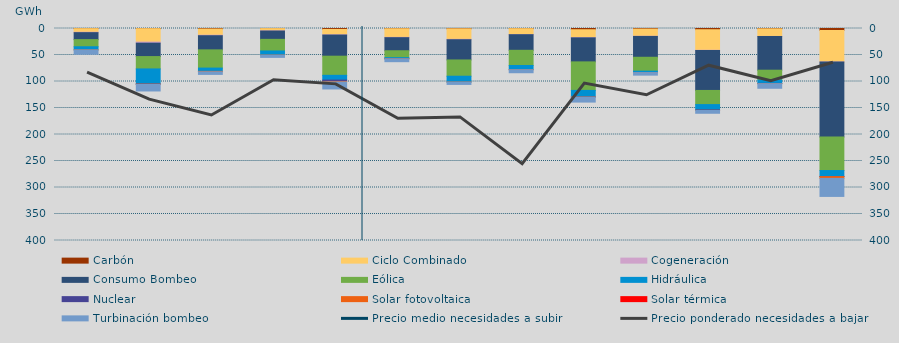
| Category | Carbón | Ciclo Combinado | Cogeneración | Consumo Bombeo | Eólica | Hidráulica | Nuclear | Solar fotovoltaica | Solar térmica | Turbinación bombeo |
|---|---|---|---|---|---|---|---|---|---|---|
| 0 | 269 | 6775.2 | 801.3 | 13110.1 | 13483.2 | 5930 | 0 | 58 | 0 | 8083.8 |
| 1 | 301 | 25336.5 | 2018 | 25298.1 | 23328.3 | 28317.4 | 441 | 400.1 | 0 | 12441 |
| 2 | 986.1 | 11670.3 | 960.4 | 26699.8 | 34355.5 | 6189.5 | 0 | 824.2 | 0 | 4935.4 |
| 3 | 189.6 | 4322.2 | 260 | 15706.7 | 21872.4 | 7879.7 | 0 | 145 | 0 | 4127.7 |
| 4 | 1762.4 | 10092.7 | 511 | 39879.1 | 36105.2 | 8975.5 | 2589.8 | 902 | 0 | 13286.1 |
| 5 | 431.9 | 16303.5 | 603.6 | 24652 | 12996.3 | 2005.4 | 25 | 151.9 | 0 | 5443.1 |
| 6 | 587 | 19880.3 | 745.7 | 38129.4 | 30707.4 | 11038.8 | 0 | 83.9 | 0 | 4346.7 |
| 7 | 318.1 | 10959 | 432 | 29416 | 28648.7 | 7863.5 | 0 | 105 | 0 | 5723.9 |
| 8 | 2349.7 | 14809.8 | 513.2 | 45318.9 | 53811.9 | 12435.2 | 162.7 | 147 | 0 | 9302.2 |
| 9 | 1032.05 | 13586.525 | 372.15 | 39287.3 | 26177.05 | 2674.925 | 0 | 91.5 | 0 | 4779.4 |
| 10 | 2338.05 | 38734.9 | 425.275 | 75366.15 | 26713.775 | 10087.325 | 758.925 | 314.05 | 0 | 5208.05 |
| 11 | 607 | 14346.825 | 84.1 | 63631.75 | 18608.375 | 6324.8 | 376.5 | 124.625 | 0 | 8670.125 |
| 12 | 3747 | 59427.025 | 92.6 | 141431.55 | 63317 | 11208.6 | 225.6 | 3390.725 | 0 | 34005.35 |